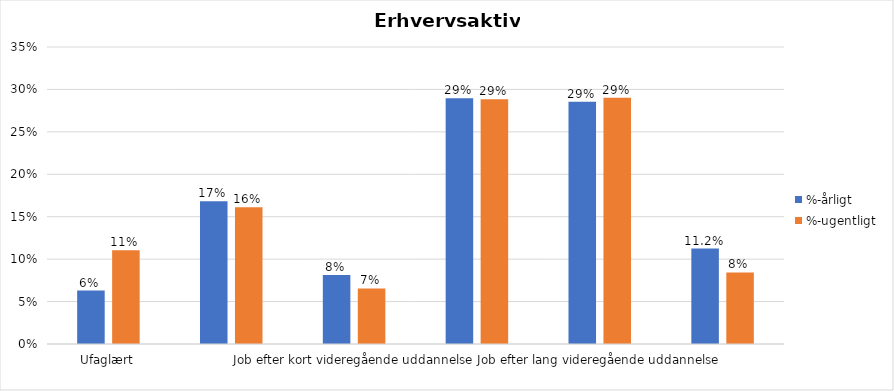
| Category | %-årligt | %-ugentligt |
|---|---|---|
| Ufaglært | 0.063 | 0.11 |
| Erhvervsfagligt job | 0.168 | 0.161 |
| Job efter kort videregående uddannelse | 0.081 | 0.066 |
| Job efter mellemlang videregående uddannelse | 0.29 | 0.288 |
| Job efter lang videregående uddannelse | 0.285 | 0.29 |
| Selvstændig | 0.112 | 0.084 |